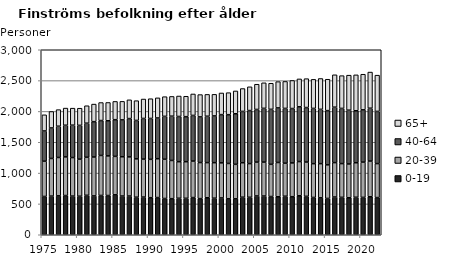
| Category | 0-19 | 20-39 | 40-64 | 65+ |
|---|---|---|---|---|
| 1975.0 | 621 | 572 | 490 | 262 |
| 1976.0 | 627 | 610 | 495 | 267 |
| 1977.0 | 631 | 622 | 507 | 269 |
| 1978.0 | 636 | 627 | 513 | 278 |
| 1979.0 | 627 | 625 | 525 | 276 |
| 1980.0 | 625 | 601 | 548 | 278 |
| 1981.0 | 640 | 617 | 552 | 283 |
| 1982.0 | 630 | 631 | 573 | 285 |
| 1983.0 | 637 | 649 | 566 | 292 |
| 1984.0 | 636 | 643 | 569 | 297 |
| 1985.0 | 648 | 623 | 595 | 296 |
| 1986.0 | 628 | 637 | 598 | 300 |
| 1987.0 | 628 | 635 | 621 | 304 |
| 1988.0 | 609 | 622 | 623 | 320 |
| 1989.0 | 611 | 616 | 659 | 315 |
| 1990.0 | 601 | 622 | 663 | 320 |
| 1991.0 | 603 | 630 | 661 | 326 |
| 1992.0 | 588 | 637 | 695 | 319 |
| 1993.0 | 585 | 620 | 718 | 320 |
| 1994.0 | 592 | 593 | 733 | 332 |
| 1995.0 | 591 | 594 | 730 | 331 |
| 1996.0 | 603 | 592 | 740 | 348 |
| 1997.0 | 586 | 585 | 740 | 362 |
| 1998.0 | 600 | 570 | 752 | 354 |
| 1999.0 | 593 | 576 | 758 | 350 |
| 2000.0 | 597 | 569 | 782 | 351 |
| 2001.0 | 583 | 573 | 791 | 357 |
| 2002.0 | 583 | 559 | 820 | 370 |
| 2003.0 | 609 | 559 | 832 | 371 |
| 2004.0 | 608 | 546 | 860 | 385 |
| 2005.0 | 629 | 549 | 854 | 409 |
| 2006.0 | 628 | 550 | 872 | 414 |
| 2007.0 | 620 | 522 | 892 | 423 |
| 2008.0 | 616 | 556 | 885 | 426 |
| 2009.0 | 625 | 535 | 889 | 437 |
| 2010.0 | 617 | 548 | 882 | 455 |
| 2011.0 | 632 | 555 | 888 | 452 |
| 2012.0 | 623 | 556 | 884 | 468 |
| 2013.0 | 605 | 548 | 896 | 471 |
| 2014.0 | 599 | 554 | 881 | 500 |
| 2015.0 | 589 | 545 | 879 | 509 |
| 2016.0 | 612 | 558 | 899 | 525 |
| 2017.0 | 607 | 547 | 895 | 531 |
| 2018.0 | 600 | 548 | 872 | 568 |
| 2019.0 | 608 | 560 | 843 | 582 |
| 2020.0 | 606 | 572 | 848 | 577 |
| 2021.0 | 616 | 579 | 857 | 586 |
| 2022.0 | 603 | 551 | 846 | 588 |